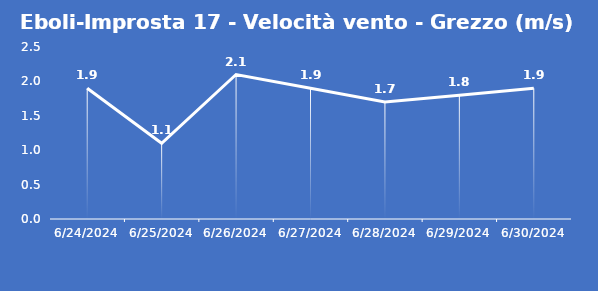
| Category | Eboli-Improsta 17 - Velocità vento - Grezzo (m/s) |
|---|---|
| 6/24/24 | 1.9 |
| 6/25/24 | 1.1 |
| 6/26/24 | 2.1 |
| 6/27/24 | 1.9 |
| 6/28/24 | 1.7 |
| 6/29/24 | 1.8 |
| 6/30/24 | 1.9 |